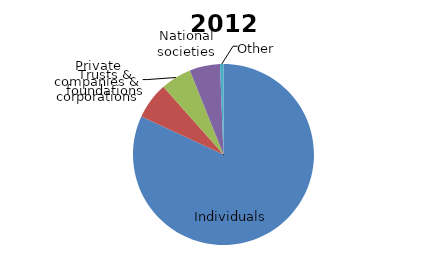
| Category | 2012 |
|---|---|
| Individuals | 0.819 |
| Trusts & foundations | 0.065 |
| Private companies & corporations | 0.055 |
| National societies | 0.054 |
| Other | 0.006 |